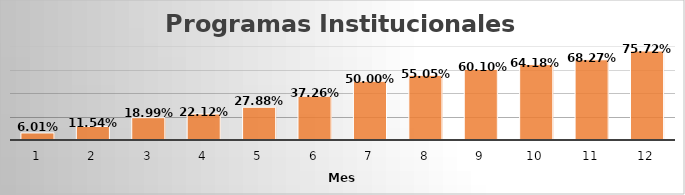
| Category | Series 0 |
|---|---|
| 1.0 | 0.06 |
| 2.0 | 0.115 |
| 3.0 | 0.19 |
| 4.0 | 0.221 |
| 5.0 | 0.279 |
| 6.0 | 0.373 |
| 7.0 | 0.5 |
| 8.0 | 0.55 |
| 9.0 | 0.601 |
| 10.0 | 0.642 |
| 11.0 | 0.683 |
| 12.0 | 0.757 |